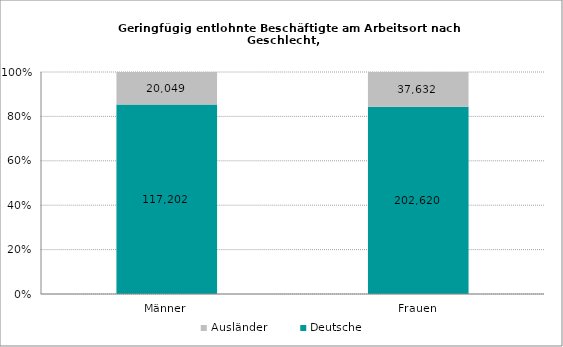
| Category | Deutsche | Ausländer |
|---|---|---|
| Männer | 117202 | 20049 |
| Frauen | 202620 | 37632 |